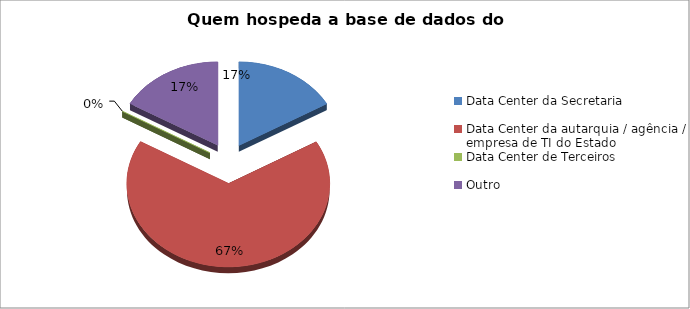
| Category | Series 0 |
|---|---|
| Data Center da Secretaria | 0.167 |
| Data Center da autarquia / agência / empresa de TI do Estado | 0.667 |
| Data Center de Terceiros  | 0 |
| Outro | 0.167 |